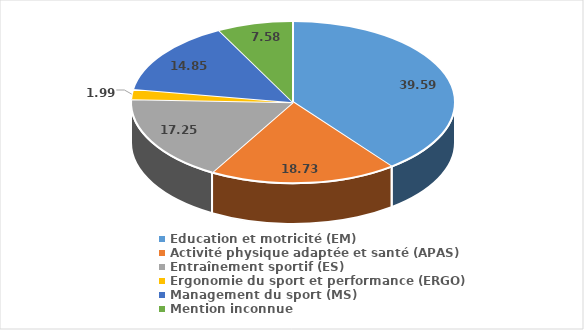
| Category | Series 0 |
|---|---|
| Education et motricité (EM) | 39.59 |
| Activité physique adaptée et santé (APAS) | 18.73 |
| Entraînement sportif (ES) | 17.25 |
| Ergonomie du sport et performance (ERGO) | 1.99 |
| Management du sport (MS) | 14.85 |
| Mention inconnue | 7.58 |